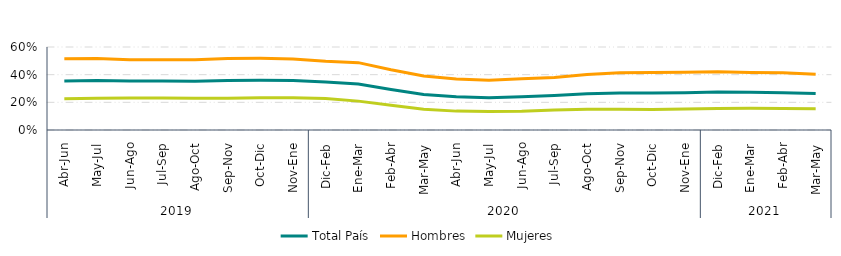
| Category | Total País | Hombres | Mujeres |
|---|---|---|---|
| 0 | 0.354 | 0.515 | 0.225 |
| 1 | 0.357 | 0.517 | 0.23 |
| 2 | 0.354 | 0.508 | 0.231 |
| 3 | 0.354 | 0.508 | 0.232 |
| 4 | 0.352 | 0.507 | 0.229 |
| 5 | 0.357 | 0.517 | 0.23 |
| 6 | 0.359 | 0.518 | 0.233 |
| 7 | 0.357 | 0.514 | 0.233 |
| 8 | 0.347 | 0.497 | 0.227 |
| 9 | 0.332 | 0.487 | 0.209 |
| 10 | 0.293 | 0.436 | 0.179 |
| 11 | 0.257 | 0.391 | 0.15 |
| 12 | 0.24 | 0.369 | 0.136 |
| 13 | 0.234 | 0.36 | 0.133 |
| 14 | 0.24 | 0.37 | 0.136 |
| 15 | 0.249 | 0.38 | 0.144 |
| 16 | 0.262 | 0.402 | 0.149 |
| 17 | 0.268 | 0.414 | 0.151 |
| 18 | 0.267 | 0.415 | 0.148 |
| 19 | 0.27 | 0.418 | 0.152 |
| 20 | 0.274 | 0.421 | 0.156 |
| 21 | 0.272 | 0.416 | 0.157 |
| 22 | 0.27 | 0.414 | 0.155 |
| 23 | 0.264 | 0.403 | 0.153 |